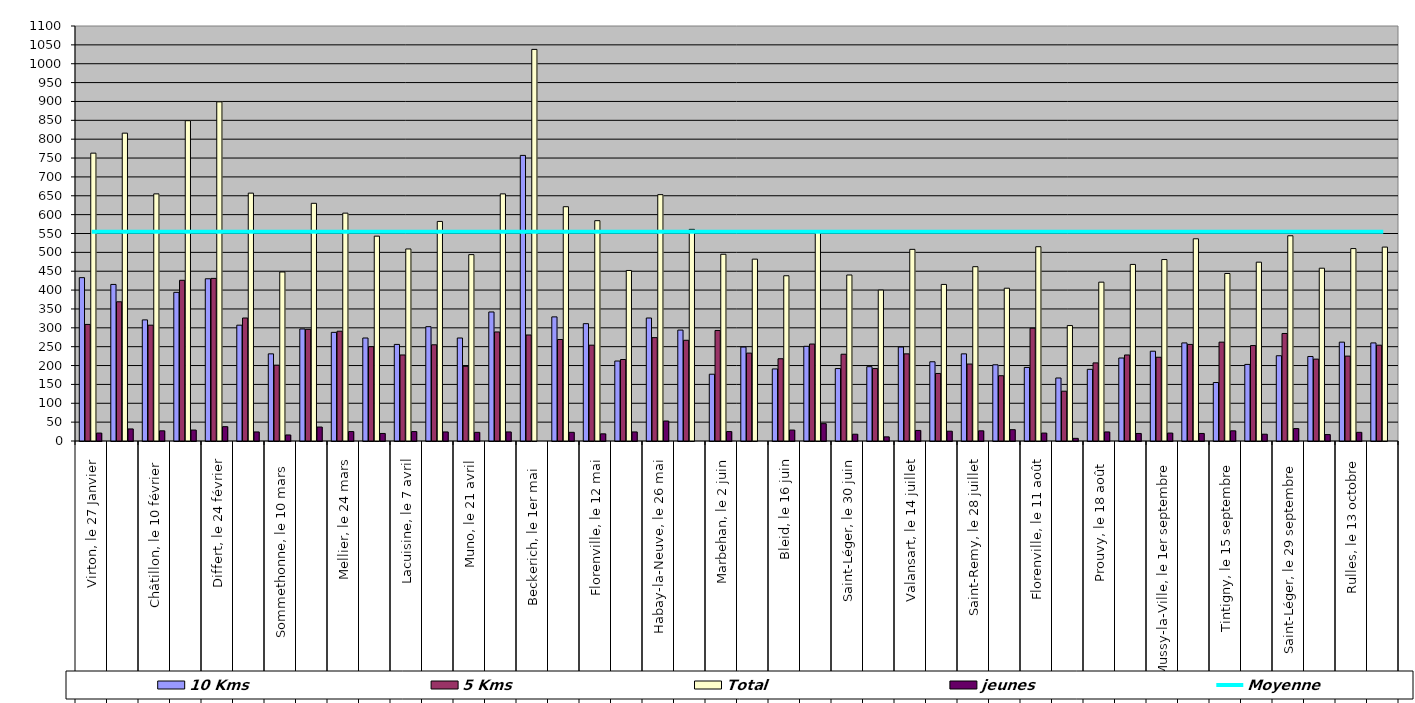
| Category | 10 Kms | 5 Kms | Total | jeunes |
|---|---|---|---|---|
| 0 | 433 | 309 | 763 | 21 |
| 1 | 415 | 369 | 816 | 32 |
| 2 | 321 | 307 | 655 | 27 |
| 3 | 394 | 426 | 849 | 29 |
| 4 | 430 | 431 | 899 | 38 |
| 5 | 307 | 326 | 657 | 24 |
| 6 | 231 | 201 | 448 | 16 |
| 7 | 297 | 296 | 630 | 37 |
| 8 | 288 | 291 | 604 | 25 |
| 9 | 273 | 250 | 543 | 20 |
| 10 | 256 | 228 | 509 | 25 |
| 11 | 303 | 255 | 582 | 24 |
| 12 | 273 | 198 | 494 | 23 |
| 13 | 342 | 289 | 655 | 24 |
| 14 | 757 | 281 | 1038 | 0 |
| 15 | 329 | 269 | 621 | 23 |
| 16 | 311 | 254 | 584 | 19 |
| 17 | 212 | 216 | 452 | 24 |
| 18 | 326 | 274 | 653 | 53 |
| 19 | 294 | 267 | 561 | 0 |
| 20 | 177 | 293 | 495 | 25 |
| 21 | 249 | 233 | 482 | 0 |
| 22 | 191 | 218 | 438 | 29 |
| 23 | 251 | 257 | 554 | 46 |
| 24 | 192 | 230 | 440 | 18 |
| 25 | 197 | 192 | 400 | 11 |
| 26 | 249 | 231 | 508 | 28 |
| 27 | 210 | 179 | 415 | 26 |
| 28 | 231 | 204 | 462 | 27 |
| 29 | 202 | 173 | 405 | 30 |
| 30 | 195 | 299 | 515 | 21 |
| 31 | 167 | 132 | 306 | 7 |
| 32 | 190 | 207 | 421 | 24 |
| 33 | 220 | 228 | 468 | 20 |
| 34 | 238 | 222 | 481 | 21 |
| 35 | 260 | 256 | 536 | 20 |
| 36 | 155 | 262 | 444 | 27 |
| 37 | 203 | 253 | 474 | 18 |
| 38 | 226 | 285 | 544 | 33 |
| 39 | 224 | 217 | 458 | 17 |
| 40 | 262 | 225 | 510 | 23 |
| 41 | 260 | 254 | 514 | 0 |